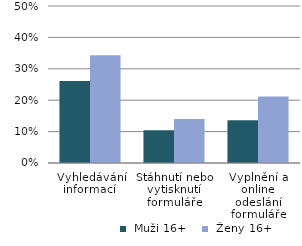
| Category |  Muži 16+ |  Ženy 16+ |
|---|---|---|
| Vyhledávání informací  | 0.261 | 0.343 |
| Stáhnutí nebo vytisknutí formuláře | 0.104 | 0.14 |
| Vyplnění a online odeslání formuláře | 0.136 | 0.212 |